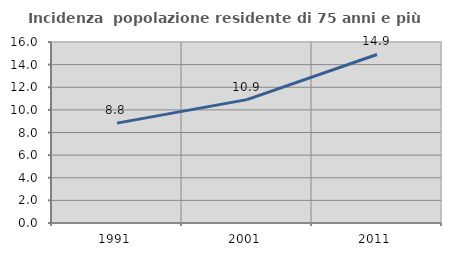
| Category | Incidenza  popolazione residente di 75 anni e più |
|---|---|
| 1991.0 | 8.828 |
| 2001.0 | 10.907 |
| 2011.0 | 14.897 |